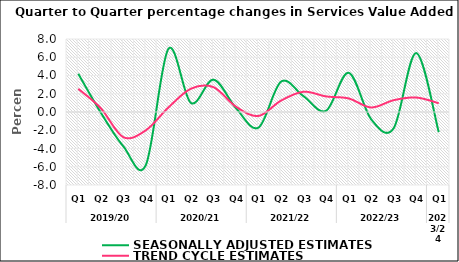
| Category | SEASONALLY ADJUSTED ESTIMATES | TREND CYCLE ESTIMATES |
|---|---|---|
| 0 | 4.188 | 2.538 |
| 1 | -0.067 | 0.416 |
| 2 | -3.759 | -2.76 |
| 3 | -5.816 | -2.004 |
| 4 | 6.916 | 0.492 |
| 5 | 0.991 | 2.553 |
| 6 | 3.542 | 2.725 |
| 7 | 0.426 | 0.583 |
| 8 | -1.712 | -0.431 |
| 9 | 3.325 | 1.251 |
| 10 | 1.726 | 2.219 |
| 11 | 0.133 | 1.706 |
| 12 | 4.296 | 1.486 |
| 13 | -0.793 | 0.497 |
| 14 | -1.782 | 1.294 |
| 15 | 6.461 | 1.589 |
| 16 | -2.205 | 0.96 |